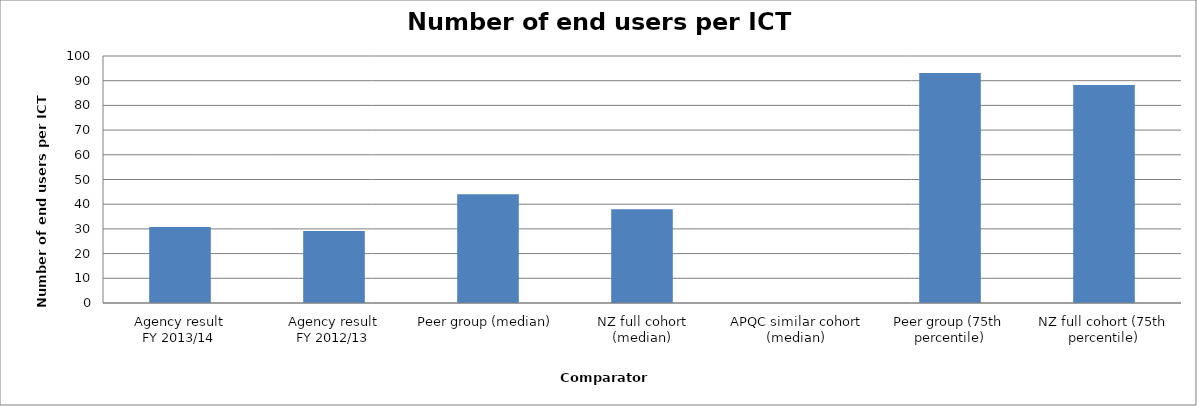
| Category | Result |
|---|---|
| Agency result
FY 2013/14 | 30.788 |
| Agency result
FY 2012/13 | 29.127 |
| Peer group (median) | 44 |
| NZ full cohort (median) | 37.909 |
| APQC similar cohort (median) | 0 |
| Peer group (75th percentile) | 93.143 |
| NZ full cohort (75th percentile) | 88.228 |